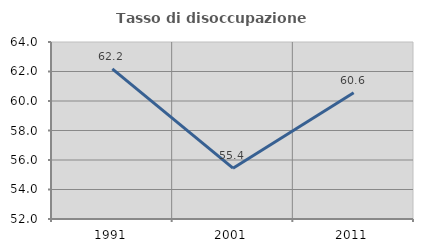
| Category | Tasso di disoccupazione giovanile  |
|---|---|
| 1991.0 | 62.179 |
| 2001.0 | 55.446 |
| 2011.0 | 60.563 |